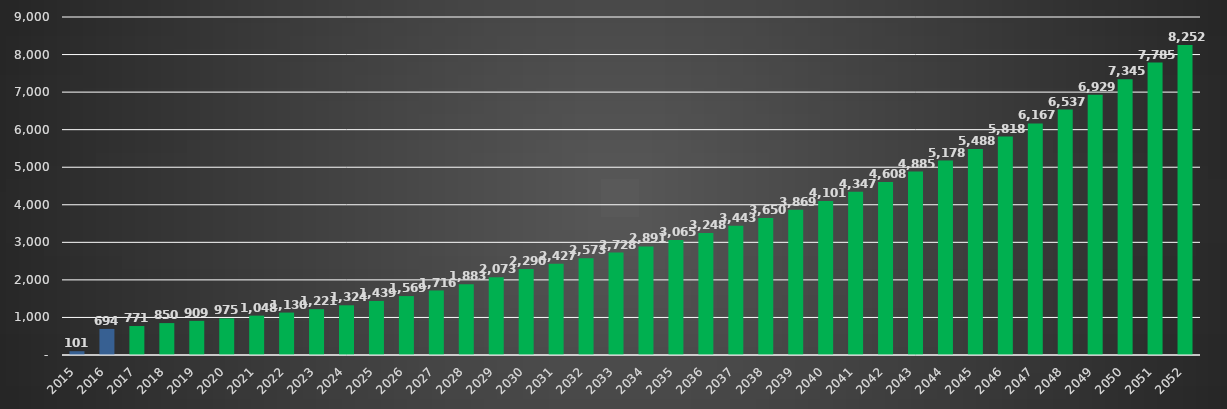
| Category | Series 1 |
|---|---|
| 2015.0 | 101.05 |
| 2016.0 | 693.84 |
| 2017.0 | 771.396 |
| 2018.0 | 849.818 |
| 2019.0 | 909.079 |
| 2020.0 | 974.849 |
| 2021.0 | 1048.037 |
| 2022.0 | 1129.7 |
| 2023.0 | 1221.068 |
| 2024.0 | 1323.579 |
| 2025.0 | 1438.912 |
| 2026.0 | 1569.034 |
| 2027.0 | 1716.252 |
| 2028.0 | 1883.275 |
| 2029.0 | 2073.294 |
| 2030.0 | 2290.062 |
| 2031.0 | 2427.466 |
| 2032.0 | 2573.114 |
| 2033.0 | 2727.5 |
| 2034.0 | 2891.15 |
| 2035.0 | 3064.619 |
| 2036.0 | 3248.497 |
| 2037.0 | 3443.406 |
| 2038.0 | 3650.011 |
| 2039.0 | 3869.011 |
| 2040.0 | 4101.152 |
| 2041.0 | 4347.221 |
| 2042.0 | 4608.055 |
| 2043.0 | 4884.538 |
| 2044.0 | 5177.61 |
| 2045.0 | 5488.267 |
| 2046.0 | 5817.563 |
| 2047.0 | 6166.616 |
| 2048.0 | 6536.613 |
| 2049.0 | 6928.81 |
| 2050.0 | 7344.539 |
| 2051.0 | 7785.211 |
| 2052.0 | 8252.324 |